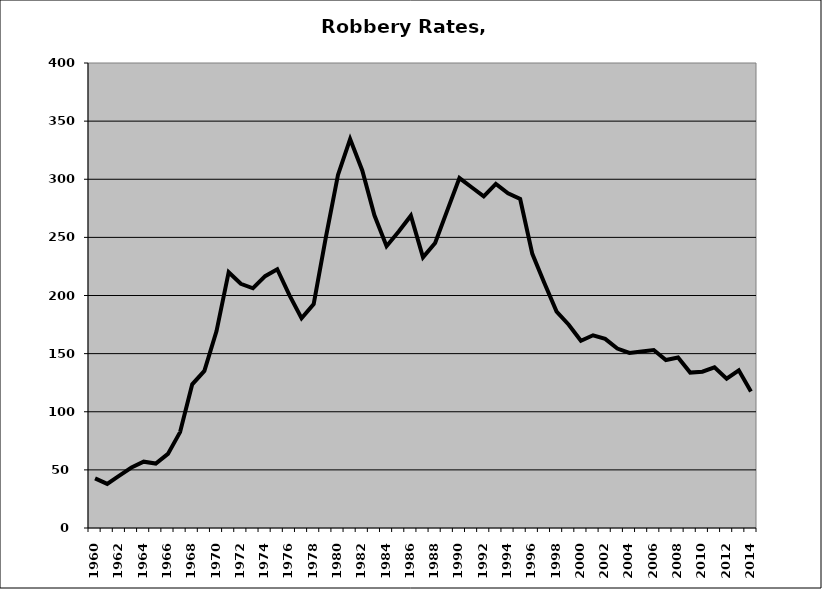
| Category | Robbery |
|---|---|
| 1960.0 | 42.708 |
| 1961.0 | 37.972 |
| 1962.0 | 45.092 |
| 1963.0 | 52.04 |
| 1964.0 | 57.049 |
| 1965.0 | 55.403 |
| 1966.0 | 63.743 |
| 1967.0 | 82.493 |
| 1968.0 | 123.58 |
| 1969.0 | 135.101 |
| 1970.0 | 169.43 |
| 1971.0 | 220.027 |
| 1972.0 | 210.099 |
| 1973.0 | 206.208 |
| 1974.0 | 216.63 |
| 1975.0 | 222.622 |
| 1976.0 | 200.314 |
| 1977.0 | 180.42 |
| 1978.0 | 192.603 |
| 1979.0 | 250.027 |
| 1980.0 | 303.712 |
| 1981.0 | 334.563 |
| 1982.0 | 307.61 |
| 1983.0 | 268.961 |
| 1984.0 | 242.422 |
| 1985.0 | 254.985 |
| 1986.0 | 268.675 |
| 1987.0 | 232.821 |
| 1988.0 | 245.168 |
| 1989.0 | 273.255 |
| 1990.0 | 301.015 |
| 1991.0 | 293.093 |
| 1992.0 | 285.223 |
| 1993.0 | 295.964 |
| 1994.0 | 287.981 |
| 1995.0 | 283.021 |
| 1996.0 | 235.829 |
| 1997.0 | 210.567 |
| 1998.0 | 186.186 |
| 1999.0 | 174.902 |
| 2000.0 | 161.07 |
| 2001.0 | 165.783 |
| 2002.0 | 162.736 |
| 2003.0 | 154.378 |
| 2004.0 | 150.556 |
| 2005.0 | 151.842 |
| 2006.0 | 153.108 |
| 2007.0 | 144.475 |
| 2008.0 | 146.605 |
| 2009.0 | 133.663 |
| 2010.0 | 134.419 |
| 2011.0 | 138.193 |
| 2012.0 | 128.387 |
| 2013.0 | 135.6 |
| 2014.0 | 117.451 |